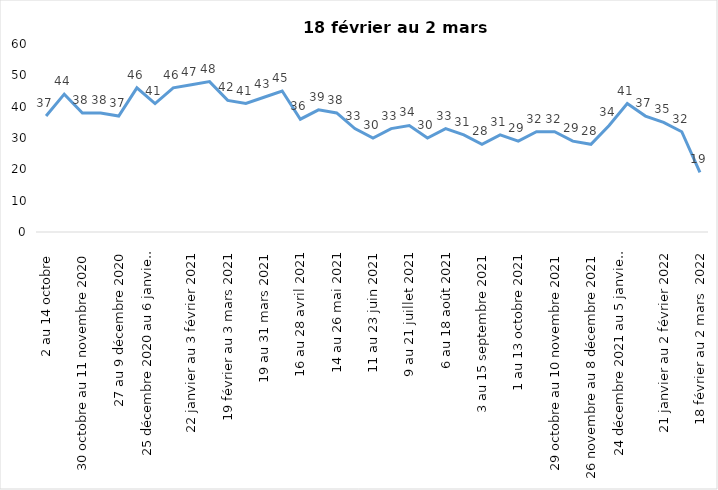
| Category | Toujours aux trois mesures |
|---|---|
| 2 au 14 octobre  | 37 |
| 16 au 28 octobre 2020 | 44 |
| 30 octobre au 11 novembre 2020 | 38 |
| 13 au 25 novembre 2020 | 38 |
| 27 au 9 décembre 2020 | 37 |
| 11 au 25 décembre 2020 | 46 |
| 25 décembre 2020 au 6 janvier 2021 | 41 |
| 8 au 20 janvier 2021 | 46 |
| 22 janvier au 3 février 2021 | 47 |
| 5 au 17 février 2021 | 48 |
| 19 février au 3 mars 2021 | 42 |
| 5 au 17 mars 2021 | 41 |
| 19 au 31 mars 2021 | 43 |
| 2 au 14 avril 2021 | 45 |
| 16 au 28 avril 2021 | 36 |
| 30 avril au 12 mai 2021 | 39 |
| 14 au 26 mai 2021 | 38 |
| 28 mai au 9 juin 2021 | 33 |
| 11 au 23 juin 2021 | 30 |
| 25 juin au 7 juillet 2021 | 33 |
| 9 au 21 juillet 2021 | 34 |
| 23 au 4 août 2021 | 30 |
| 6 au 18 août 2021 | 33 |
| 20 août au 1er septembre 2021 | 31 |
| 3 au 15 septembre 2021 | 28 |
| 17 au 29 septembre 2021 | 31 |
| 1 au 13 octobre 2021 | 29 |
| 15 au 27 octobre 2021 | 32 |
| 29 octobre au 10 novembre 2021 | 32 |
| 12 au 24 novembre 2021 | 29 |
| 26 novembre au 8 décembre 2021 | 28 |
| 10 au 22 décembre 2021 | 34 |
| 24 décembre 2021 au 5 janvier 2022 | 41 |
| 7 au 19 janvier 2022 | 37 |
| 21 janvier au 2 février 2022 | 35 |
| 4 au 16 février 2022 | 32 |
| 18 février au 2 mars  2022 | 19 |